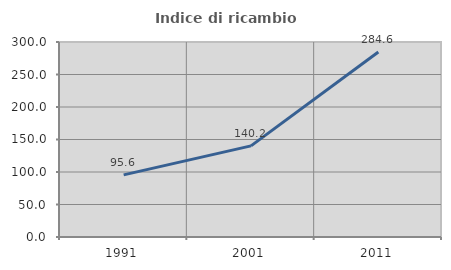
| Category | Indice di ricambio occupazionale  |
|---|---|
| 1991.0 | 95.603 |
| 2001.0 | 140.174 |
| 2011.0 | 284.615 |